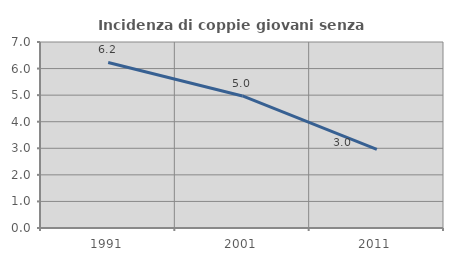
| Category | Incidenza di coppie giovani senza figli |
|---|---|
| 1991.0 | 6.231 |
| 2001.0 | 4.971 |
| 2011.0 | 2.963 |